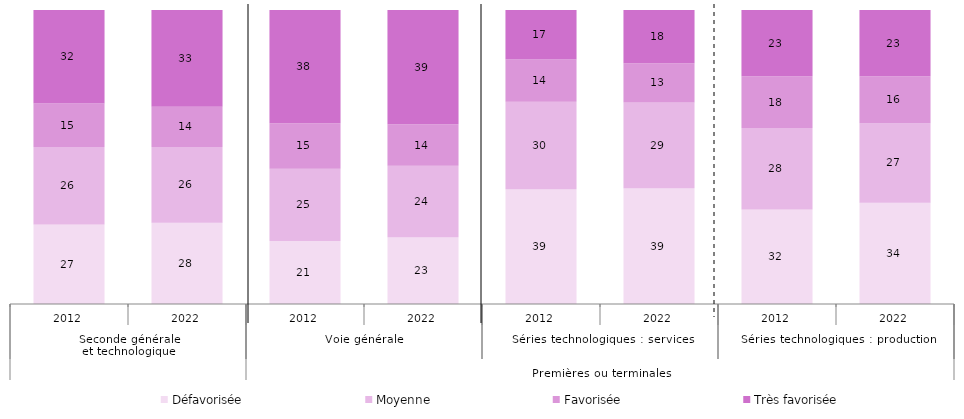
| Category | Défavorisée | Moyenne | Favorisée | Très favorisée |
|---|---|---|---|---|
| 0 | 27.05 | 26.336 | 14.803 | 31.811 |
| 1 | 27.677 | 25.692 | 13.729 | 32.902 |
| 2 | 21.462 | 24.575 | 15.464 | 38.499 |
| 3 | 22.684 | 24.338 | 14.082 | 38.896 |
| 4 | 39.052 | 29.737 | 14.34 | 16.871 |
| 5 | 39.383 | 29.159 | 13.376 | 18.082 |
| 6 | 32.166 | 27.716 | 17.574 | 22.544 |
| 7 | 34.459 | 27.033 | 15.975 | 22.534 |